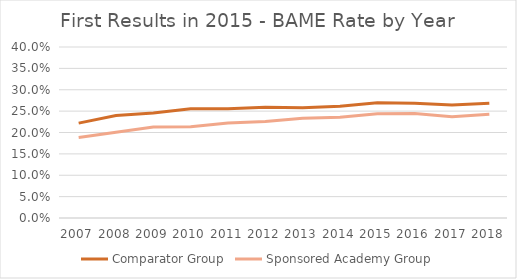
| Category | Comparator Group | Sponsored Academy Group |
|---|---|---|
| 2007.0 | 0.222 | 0.188 |
| 2008.0 | 0.24 | 0.2 |
| 2009.0 | 0.245 | 0.213 |
| 2010.0 | 0.255 | 0.214 |
| 2011.0 | 0.256 | 0.222 |
| 2012.0 | 0.259 | 0.226 |
| 2013.0 | 0.258 | 0.233 |
| 2014.0 | 0.262 | 0.236 |
| 2015.0 | 0.27 | 0.244 |
| 2016.0 | 0.269 | 0.244 |
| 2017.0 | 0.264 | 0.237 |
| 2018.0 | 0.268 | 0.242 |